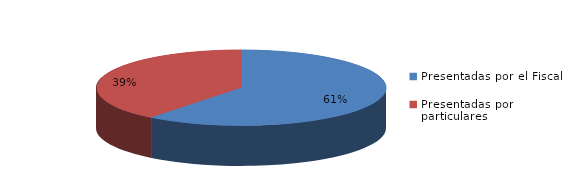
| Category | Series 0 |
|---|---|
| Presentadas por el Fiscal | 123 |
| Presentadas por particulares | 80 |